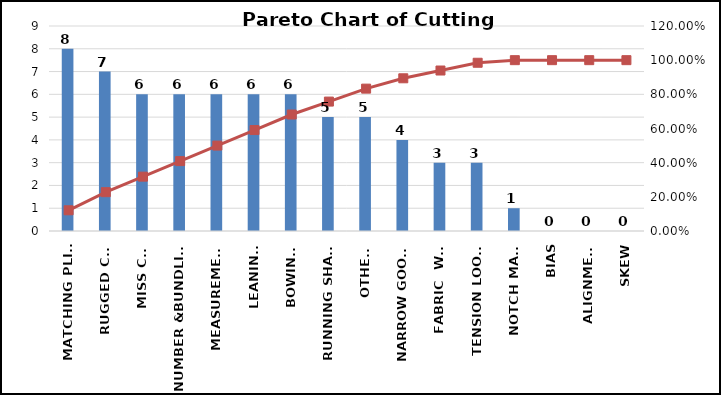
| Category | Count |
|---|---|
| MATCHING PLIES | 8 |
| RUGGED CUT | 7 |
| MISS CUT | 6 |
| NUMBER &BUNDLING | 6 |
| MEASUREMENT | 6 |
| LEANING | 6 |
| BOWING  | 6 |
| RUNNING SHADE | 5 |
| OTHERS | 5 |
| NARROW GOODS | 4 |
| FABRIC  WAY | 3 |
| TENSION LOOSE | 3 |
| NOTCH MARK | 1 |
| BIAS | 0 |
| ALIGNMENT | 0 |
|  SKEW | 0 |